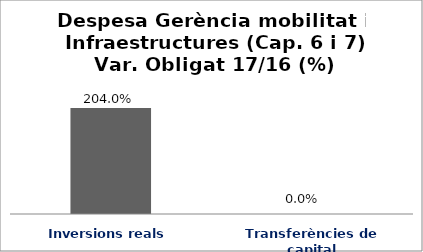
| Category | Series 0 |
|---|---|
| Inversions reals | 2.04 |
| Transferències de capital | 0 |